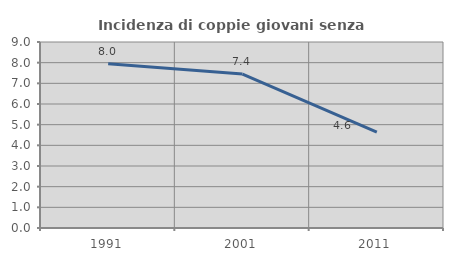
| Category | Incidenza di coppie giovani senza figli |
|---|---|
| 1991.0 | 7.953 |
| 2001.0 | 7.446 |
| 2011.0 | 4.636 |